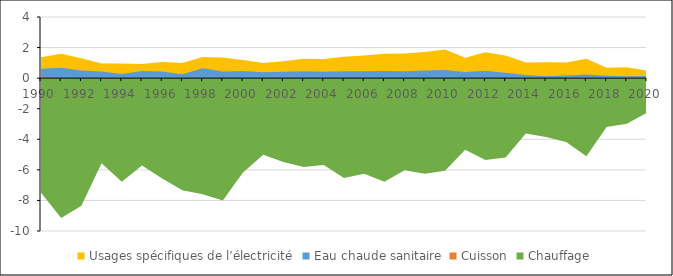
| Category | Usages spécifiques de l’électricité | Eau chaude sanitaire | Cuisson | Chauffage |
|---|---|---|---|---|
| 1990.0 | 1.366 | 0.611 | 0.062 | -7.497 |
| 1991.0 | 1.591 | 0.681 | 0.015 | -9.145 |
| 1992.0 | 1.3 | 0.497 | -0.049 | -8.344 |
| 1993.0 | 0.959 | 0.43 | 0.006 | -5.574 |
| 1994.0 | 0.955 | 0.271 | -0.098 | -6.776 |
| 1995.0 | 0.93 | 0.461 | 0.015 | -5.719 |
| 1996.0 | 1.053 | 0.435 | -0.033 | -6.567 |
| 1997.0 | 0.998 | 0.257 | -0.132 | -7.341 |
| 1998.0 | 1.378 | 0.645 | 0.02 | -7.603 |
| 1999.0 | 1.348 | 0.44 | -0.083 | -8.012 |
| 2000.0 | 1.187 | 0.475 | -0.011 | -6.174 |
| 2001.0 | 0.997 | 0.39 | -0.011 | -5.017 |
| 2002.0 | 1.107 | 0.419 | -0.012 | -5.491 |
| 2003.0 | 1.276 | 0.45 | -0.02 | -5.814 |
| 2004.0 | 1.258 | 0.423 | -0.027 | -5.685 |
| 2005.0 | 1.405 | 0.459 | -0.039 | -6.537 |
| 2006.0 | 1.483 | 0.444 | -0.023 | -6.256 |
| 2007.0 | 1.597 | 0.465 | -0.02 | -6.777 |
| 2008.0 | 1.609 | 0.449 | -0.01 | -6.02 |
| 2009.0 | 1.707 | 0.498 | -0.009 | -6.247 |
| 2010.0 | 1.881 | 0.539 | -0.03 | -6.051 |
| 2011.0 | 1.34 | 0.397 | -0.013 | -4.678 |
| 2012.0 | 1.696 | 0.491 | -0.036 | -5.363 |
| 2013.0 | 1.482 | 0.355 | -0.081 | -5.192 |
| 2014.0 | 1.029 | 0.212 | -0.022 | -3.622 |
| 2015.0 | 1.042 | 0.12 | -0.029 | -3.853 |
| 2016.0 | 1.025 | 0.174 | 0.034 | -4.172 |
| 2017.0 | 1.262 | 0.23 | 0.065 | -5.112 |
| 2018.0 | 0.68 | 0.154 | 0.074 | -3.204 |
| 2019.0 | 0.707 | 0.117 | 0.068 | -2.98 |
| 2020.0 | 0.493 | 0.143 | 0.062 | -2.254 |